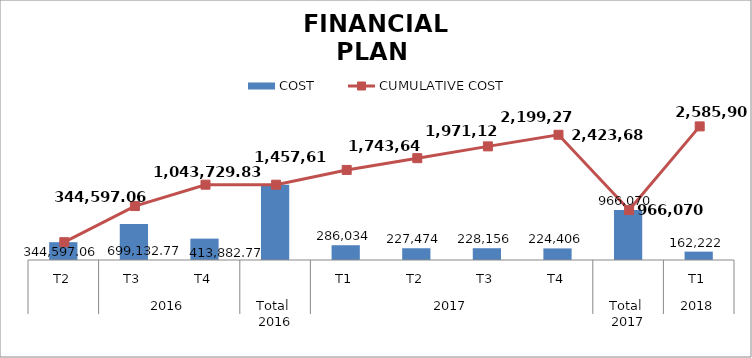
| Category | COST |
|---|---|
| 0 | 344597.06 |
| 1 | 699132.77 |
| 2 | 413882.77 |
| 3 | 1457612.6 |
| 4 | 286033.55 |
| 5 | 227474.33 |
| 6 | 228156.14 |
| 7 | 224406.14 |
| 8 | 966070.16 |
| 9 | 162222.24 |